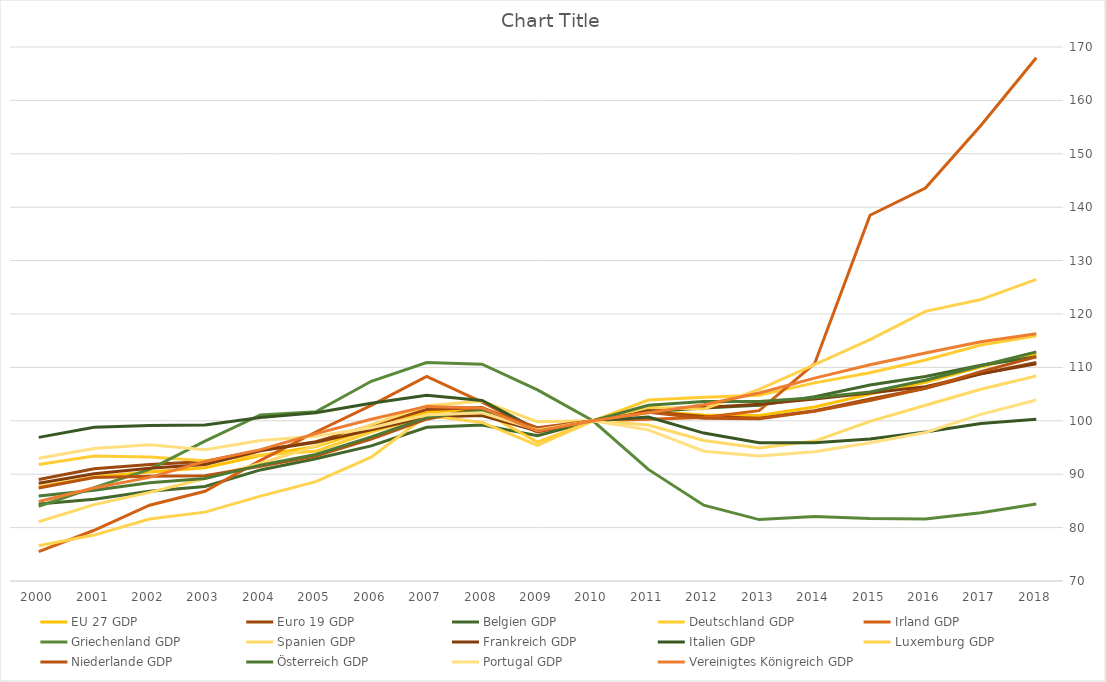
| Category | Jahr | EU 27 | Euro 19 | Belgien | Deutschland | Irland | Griechenland | Spanien | Frankreich | Italien | Luxemburg | Niederlande | Österreich | Portugal | Vereinigtes Königreich |
|---|---|---|---|---|---|---|---|---|---|---|---|---|---|---|---|
| 2000 |  |  |  |  |  |  |  |  |  |  |  |  |  |  | 84.9 |
| 2001 |  |  |  |  |  |  |  |  |  |  |  |  |  |  | 87.4 |
| 2002 |  |  |  |  |  |  |  |  |  |  |  |  |  |  | 89.4 |
| 2003 |  |  |  |  |  |  |  |  |  |  |  |  |  |  | 92.4 |
| 2004 |  |  |  |  |  |  |  |  |  |  |  |  |  |  | 94.6 |
| 2005 |  |  |  |  |  |  |  |  |  |  |  |  |  |  | 97.6 |
| 2006 |  |  |  |  |  |  |  |  |  |  |  |  |  |  | 100.3 |
| 2007 |  |  |  |  |  |  |  |  |  |  |  |  |  |  | 102.7 |
| 2008 |  |  |  |  |  |  |  |  |  |  |  |  |  |  | 102.4 |
| 2009 |  |  |  |  |  |  |  |  |  |  |  |  |  |  | 98.1 |
| 2010 |  |  |  |  |  |  |  |  |  |  |  |  |  |  | 100 |
| 2011 |  |  |  |  |  |  |  |  |  |  |  |  |  |  | 101.5 |
| 2012 |  |  |  |  |  |  |  |  |  |  |  |  |  |  | 103 |
| 2013 |  |  |  |  |  |  |  |  |  |  |  |  |  |  | 105.2 |
| 2014 |  |  |  |  |  |  |  |  |  |  |  |  |  |  | 108 |
| 2015 |  |  |  |  |  |  |  |  |  |  |  |  |  |  | 110.5 |
| 2016 |  |  |  |  |  |  |  |  |  |  |  |  |  |  | 112.7 |
| 2017 |  |  |  |  |  |  |  |  |  |  |  |  |  |  | 114.8 |
| 2018 |  |  |  |  |  |  |  |  |  |  |  |  |  |  | 116.3 |